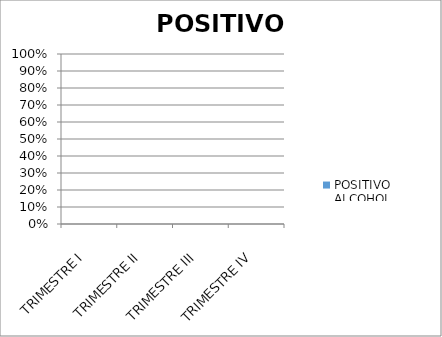
| Category | POSITIVO ALCOHOL |
|---|---|
| TRIMESTRE I | 0 |
| TRIMESTRE II | 0 |
| TRIMESTRE III | 0 |
| TRIMESTRE IV | 0 |